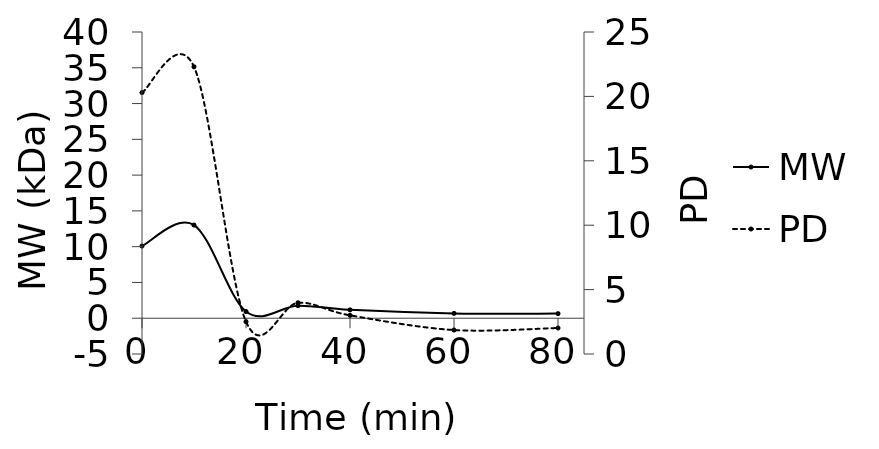
| Category | MW |
|---|---|
| 0.0 | 10.091 |
| 10.0 | 13.019 |
| 20.0 | 0.934 |
| 30.0 | 1.754 |
| 40.0 | 1.167 |
| 60.0 | 0.676 |
| 80.0 | 0.645 |